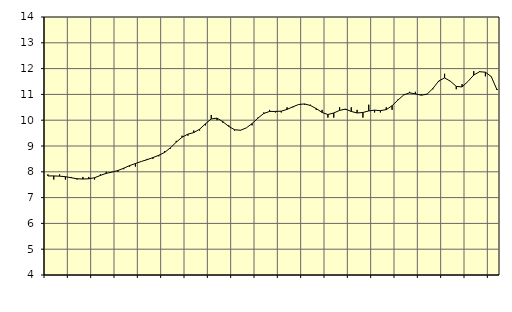
| Category | Piggar | Byggverksamhet, SNI 41-43 |
|---|---|---|
| nan | 7.9 | 7.84 |
| 1.0 | 7.7 | 7.84 |
| 1.0 | 7.9 | 7.83 |
| 1.0 | 7.7 | 7.81 |
| nan | 7.8 | 7.77 |
| 2.0 | 7.7 | 7.73 |
| 2.0 | 7.8 | 7.72 |
| 2.0 | 7.8 | 7.73 |
| nan | 7.7 | 7.77 |
| 3.0 | 7.9 | 7.86 |
| 3.0 | 8 | 7.94 |
| 3.0 | 8 | 7.99 |
| nan | 8 | 8.05 |
| 4.0 | 8.1 | 8.14 |
| 4.0 | 8.2 | 8.24 |
| 4.0 | 8.2 | 8.32 |
| nan | 8.4 | 8.4 |
| 5.0 | 8.5 | 8.47 |
| 5.0 | 8.5 | 8.55 |
| 5.0 | 8.6 | 8.64 |
| nan | 8.8 | 8.75 |
| 6.0 | 8.9 | 8.93 |
| 6.0 | 9.2 | 9.15 |
| 6.0 | 9.4 | 9.34 |
| nan | 9.4 | 9.46 |
| 7.0 | 9.6 | 9.52 |
| 7.0 | 9.6 | 9.65 |
| 7.0 | 9.8 | 9.86 |
| nan | 10.2 | 10.05 |
| 8.0 | 10 | 10.08 |
| 8.0 | 9.9 | 9.94 |
| 8.0 | 9.8 | 9.76 |
| nan | 9.6 | 9.63 |
| 9.0 | 9.6 | 9.61 |
| 9.0 | 9.7 | 9.7 |
| 9.0 | 9.8 | 9.87 |
| nan | 10.1 | 10.08 |
| 10.0 | 10.3 | 10.26 |
| 10.0 | 10.4 | 10.34 |
| 10.0 | 10.3 | 10.34 |
| nan | 10.3 | 10.35 |
| 11.0 | 10.5 | 10.42 |
| 11.0 | 10.5 | 10.52 |
| 11.0 | 10.6 | 10.61 |
| nan | 10.6 | 10.63 |
| 12.0 | 10.6 | 10.57 |
| 12.0 | 10.4 | 10.45 |
| 12.0 | 10.4 | 10.3 |
| nan | 10.1 | 10.22 |
| 13.0 | 10.1 | 10.28 |
| 13.0 | 10.5 | 10.38 |
| 13.0 | 10.4 | 10.43 |
| nan | 10.5 | 10.34 |
| 14.0 | 10.4 | 10.28 |
| 14.0 | 10.1 | 10.3 |
| 14.0 | 10.6 | 10.36 |
| nan | 10.3 | 10.39 |
| 15.0 | 10.3 | 10.37 |
| 15.0 | 10.5 | 10.41 |
| 15.0 | 10.4 | 10.56 |
| nan | 10.8 | 10.78 |
| 16.0 | 11 | 10.98 |
| 16.0 | 11.1 | 11.06 |
| 16.0 | 11.1 | 11.02 |
| nan | 11 | 10.97 |
| 17.0 | 11 | 11.01 |
| 17.0 | 11.2 | 11.23 |
| 17.0 | 11.5 | 11.52 |
| nan | 11.8 | 11.64 |
| 18.0 | 11.5 | 11.51 |
| 18.0 | 11.2 | 11.31 |
| 18.0 | 11.4 | 11.29 |
| nan | 11.5 | 11.5 |
| 19.0 | 11.9 | 11.75 |
| 19.0 | 11.9 | 11.88 |
| 19.0 | 11.7 | 11.86 |
| nan | 11.7 | 11.69 |
| 20.0 | 11.2 | 11.17 |